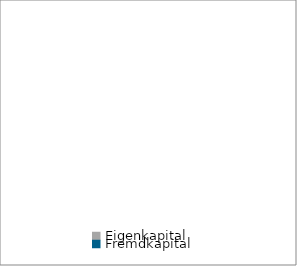
| Category | Series 0 |
|---|---|
| Eigenkapital | 0 |
| Fremdkapital | 0 |